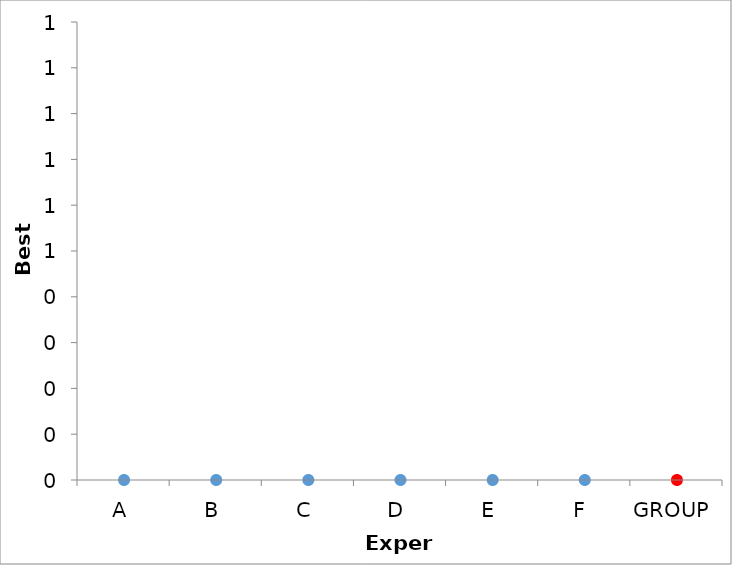
| Category | Series 1 | Series 0 |
|---|---|---|
| A | 0 | 0 |
| B | 0 | 0 |
| C | 0 | 0 |
| D | 0 | 0 |
| E | 0 | 0 |
| F | 0 | 0 |
| GROUP | 0 | 0 |